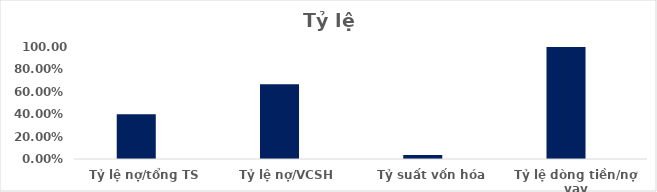
| Category | Series 0 | Series 1 | Series 2 | Series 3 | Series 4 | Series 5 | Series 6 |
|---|---|---|---|---|---|---|---|
| Tỷ lệ nợ/tổng TS | 0.401 |  |  |  |  |  |  |
| Tỷ lệ nợ/VCSH | 0.668 |  |  |  |  |  |  |
| Tỷ suất vốn hóa | 0.036 |  |  |  |  |  |  |
| Tỷ lệ dòng tiền/nợ vay | 2.078 |  |  |  |  |  |  |